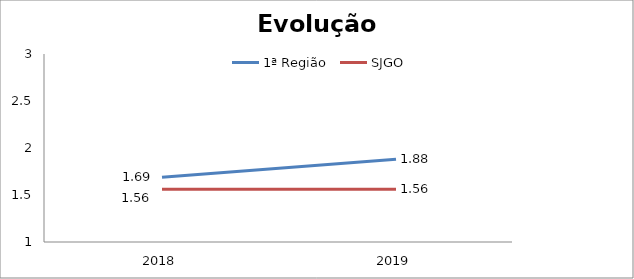
| Category | 1ª Região | SJGO |
|---|---|---|
| 0 | 1.69 | 1.56 |
| 1 | 1.88 | 1.56 |